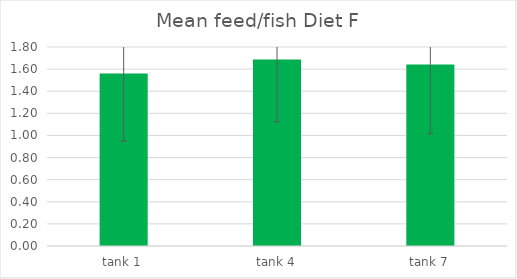
| Category | Diet F |
|---|---|
| tank 1 | 1.56 |
| tank 4 | 1.688 |
| tank 7 | 1.641 |